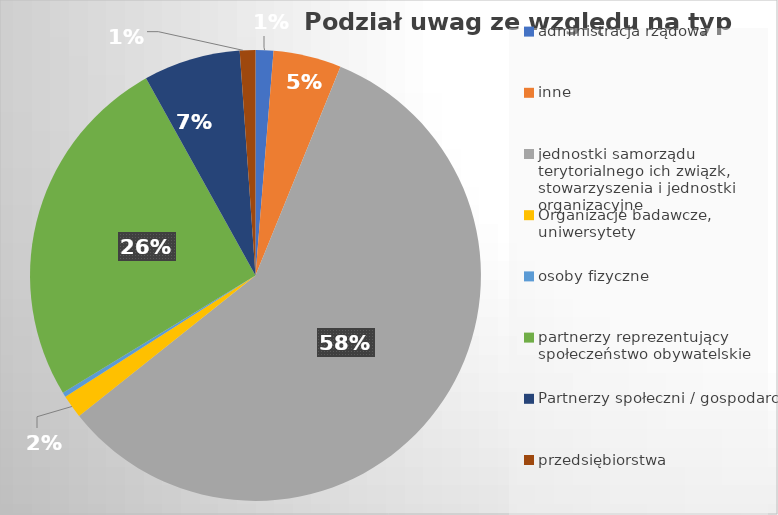
| Category | Series 0 |
|---|---|
| administracja rządowa | 16 |
| inne | 61 |
| jednostki samorządu terytorialnego ich związk, stowarzyszenia i jednostki organizacyjne | 728 |
| Organizacje badawcze, uniwersytety | 21 |
| osoby fizyczne | 4 |
| partnerzy reprezentujący społeczeństwo obywatelskie | 321 |
| Partnerzy społeczni / gospodarczy | 87 |
| przedsiębiorstwa | 14 |